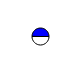
| Category | Series 0 |
|---|---|
| 0 | 3003535 |
| 1 | 2981403 |